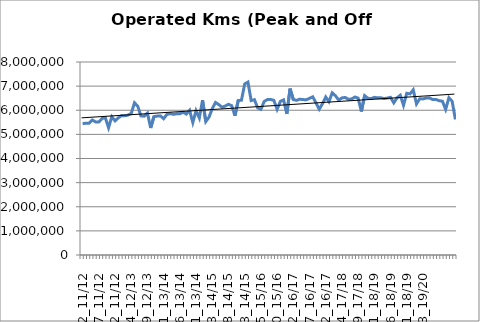
| Category | Operated Kms (Peak and Off Peak) |
|---|---|
| 02_11/12 | 5444365 |
| 03_11/12 | 5463579.766 |
| 04_11/12 | 5465179.736 |
| 05_11/12 | 5595331.58 |
| 06_11/12 | 5516501.886 |
| 07_11/12 | 5512263.678 |
| 08_11/12 | 5657701.169 |
| 09_11/12 | 5694703.315 |
| 10_11/12 | 5275158.468 |
| 11_11/12 | 5730948.298 |
| 12_11/12 | 5559546.585 |
| 13_11/12 | 5682739.548 |
| 01_12/13 | 5779011.554 |
| 02_12/13 | 5769291.823 |
| 03_12/13 | 5797899.56 |
| 04_12/13 | 5868754.671 |
| 05_12/13 | 6307700.848 |
| 06_12/13 | 6170224.893 |
| 07_12/13 | 5765718.974 |
| 08_12/13 | 5754595.346 |
| 09_12/13 | 5880486.315 |
| 10_12/13 | 5265724.545 |
| 11_12/13 | 5735096.198 |
| 12_12/13 | 5758092.317 |
| 13_12/13 | 5766533.552 |
| 01_13/14 | 5649820.769 |
| 02_13/14 | 5828067.841 |
| 03_13/14 | 5860976.379 |
| 04_13/14 | 5829549.933 |
| 05_13/14 | 5852635.738 |
| 06_13/14 | 5855176.546 |
| 07_13/14 | 5915317.321 |
| 08_13/14 | 5841974.818 |
| 09_13/14 | 5999356.536 |
| 10_13/14 | 5491314.72 |
| 11_13/14 | 5982702.698 |
| 12_13/14 | 5678656.486 |
| 13_13/14 | 6419287.862 |
| 01_14/15 | 5530730.948 |
| 02_14/15 | 5714976.833 |
| 03_14/15 | 6068517.351 |
| 04_14/15 | 6323488.507 |
| 05_14/15 | 6234868.793 |
| 06_14/15 | 6126215.061 |
| 07_14/15 | 6175050.39 |
| 08_14/15 | 6245713.388 |
| 09_14/15 | 6188339.826 |
| 10_14/15 | 5771837.362 |
| 11_14/15 | 6401920.387 |
| 12_14/15 | 6416008.265 |
| 13_14/15 | 7089688.806 |
| 01_15/16 | 7166725.805 |
| 02_15/16 | 6400939.454 |
| 03_15/16 | 6436366.801 |
| 04_15/16 | 6098982.917 |
| 05_15/16 | 6037060.146 |
| 06_15/16 | 6362284.762 |
| 07_15/16 | 6442161.389 |
| 08_15/16 | 6447835.879 |
| 09_15/16 | 6410215.367 |
| 10_15/16 | 6037739.563 |
| 11_15/16 | 6366507.681 |
| 12_15/16 | 6431406.486 |
| 13_15/16 | 5845997.798 |
| 01_16/17 | 6896305.736 |
| 02_16/17 | 6444832.23 |
| 03_16/17 | 6409496.514 |
| 04_16/17 | 6458081.677 |
| 05_16/17 | 6442271.903 |
| 06_16/17 | 6433713.582 |
| 07_16/17 | 6495238.988 |
| 08_16/17 | 6555570.678 |
| 09_16/17 | 6303106.932 |
| 10_16/17 | 6041397.478 |
| 11_16/17 | 6270763.08 |
| 12_16/17 | 6548192.666 |
| 13_16/17 | 6354168.453 |
| 01_17/18 | 6723119.107 |
| 02_17/18 | 6600251.629 |
| 03_17/18 | 6421686.844 |
| 04_17/18 | 6512512.475 |
| 05_17/18 | 6529112.977 |
| 06_17/18 | 6455556.325 |
| 07_17/18 | 6467084.897 |
| 08_17/18 | 6548391.271 |
| 09_17/18 | 6503496.862 |
| 10_17/18 | 5947231.472 |
| 11_17/18 | 6603902.697 |
| 12_17/18 | 6496743.493 |
| 13_17/18 | 6482053.735 |
| 01_18/19 | 6534809.896 |
| 02_18/19 | 6517457.994 |
| 03_18/19 | 6515241.342 |
| 04_18/19 | 6485307.417 |
| 05_18/19 | 6504212.331 |
| 06_18/19 | 6534835.325 |
| 07_18/19 | 6305882.584 |
| 08_18/19 | 6515486.952 |
| 09_18/19 | 6621179.463 |
| 10_18/19 | 6205183 |
| 11_18/19 | 6703177 |
| 12_18/19 | 6678502 |
| 13_18/19 | 6845440 |
| 01_19/20 | 6263105 |
| 02_19/20 | 6478418 |
| 03_19/20 | 6469501 |
| 04_19/20 | 6505528 |